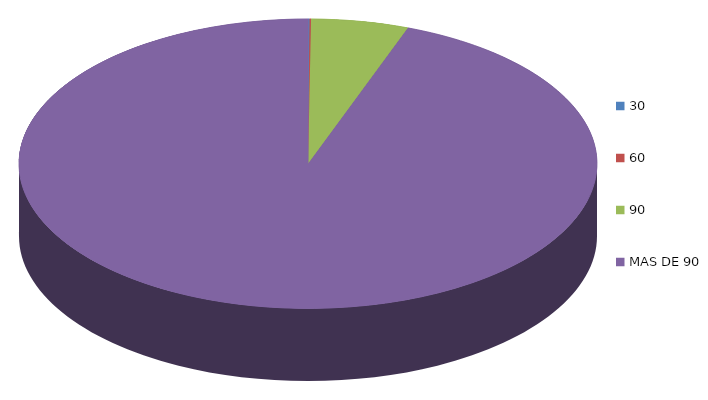
| Category | Series 0 | 56,259.8 |
|---|---|---|
| 0 | 56259.8 |  |
| 1 | 59772.2 |  |
| 2 | 3743931.3 |  |
| 3 | 64914058.5 |  |